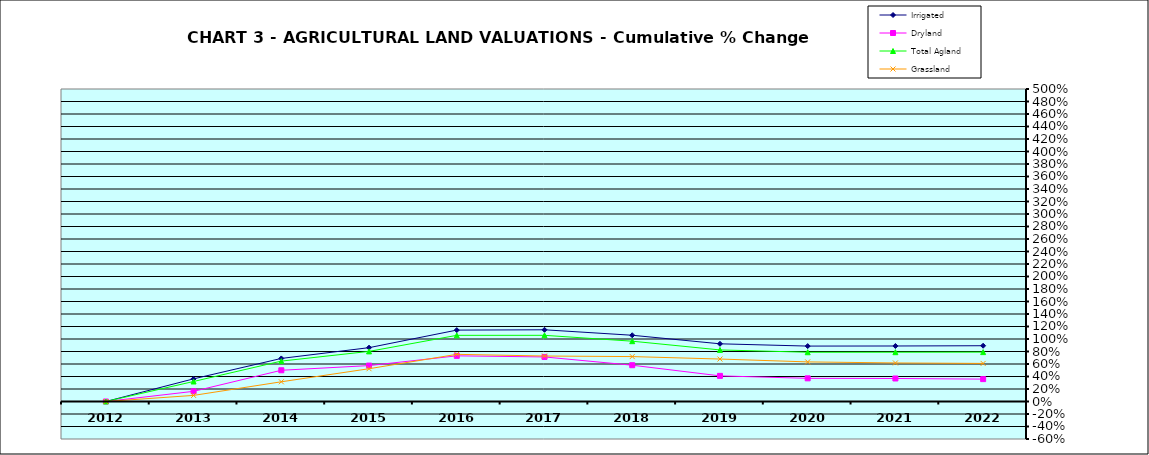
| Category | Irrigated | Dryland | Total Agland | Grassland |
|---|---|---|---|---|
| 2012.0 | 0 | 0 | 0 | 0 |
| 2013.0 | 0.362 | 0.163 | 0.32 | 0.098 |
| 2014.0 | 0.689 | 0.5 | 0.646 | 0.315 |
| 2015.0 | 0.861 | 0.575 | 0.802 | 0.524 |
| 2016.0 | 1.142 | 0.731 | 1.059 | 0.755 |
| 2017.0 | 1.147 | 0.713 | 1.059 | 0.728 |
| 2018.0 | 1.06 | 0.581 | 0.965 | 0.719 |
| 2019.0 | 0.923 | 0.41 | 0.825 | 0.679 |
| 2020.0 | 0.887 | 0.371 | 0.788 | 0.634 |
| 2021.0 | 0.888 | 0.368 | 0.789 | 0.617 |
| 2022.0 | 0.892 | 0.358 | 0.79 | 0.609 |